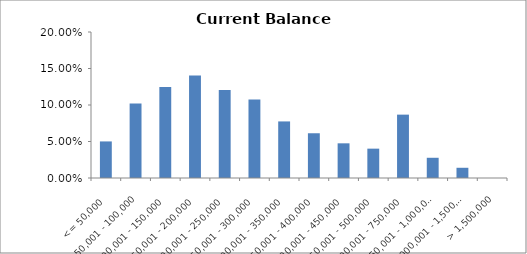
| Category | Series1 |
|---|---|
| <= 50,000 | 0.05 |
| 50,001 - 100,000 | 0.102 |
| 100,001 - 150,000 | 0.125 |
| 150,001 - 200,000 | 0.14 |
| 200,001 - 250,000 | 0.12 |
| 250,001 - 300,000 | 0.107 |
| 300,001 - 350,000 | 0.078 |
| 350,001 - 400,000 | 0.061 |
| 400,001 - 450,000 | 0.048 |
| 450,001 - 500,000 | 0.04 |
| 500,001 - 750,000 | 0.087 |
| 750,001 - 1,000,000 | 0.028 |
| 1,000,001 - 1,500,000 | 0.014 |
| > 1,500,000 | 0 |